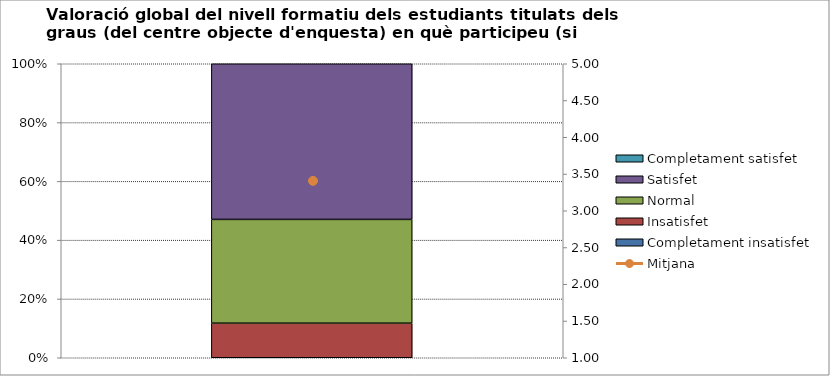
| Category | Completament insatisfet | Insatisfet | Normal | Satisfet | Completament satisfet |
|---|---|---|---|---|---|
| 0 | 0 | 2 | 6 | 9 | 0 |